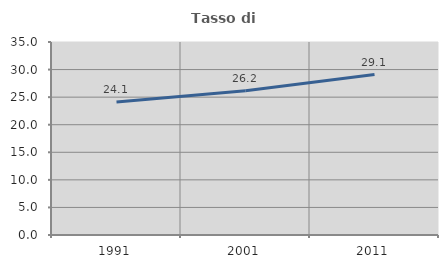
| Category | Tasso di occupazione   |
|---|---|
| 1991.0 | 24.121 |
| 2001.0 | 26.163 |
| 2011.0 | 29.104 |